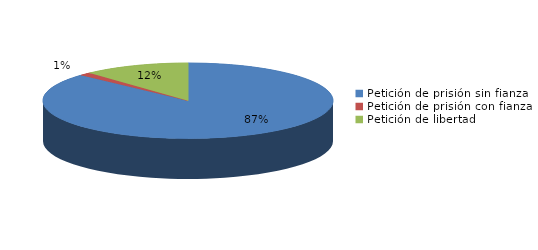
| Category | Series 0 |
|---|---|
| Petición de prisión sin fianza | 658 |
| Petición de prisión con fianza | 10 |
| Petición de libertad | 90 |